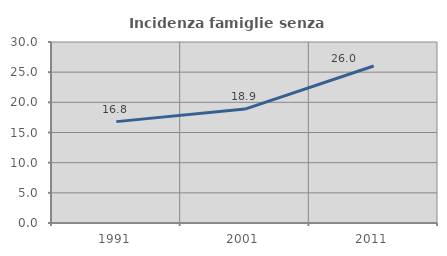
| Category | Incidenza famiglie senza nuclei |
|---|---|
| 1991.0 | 16.802 |
| 2001.0 | 18.885 |
| 2011.0 | 26.027 |